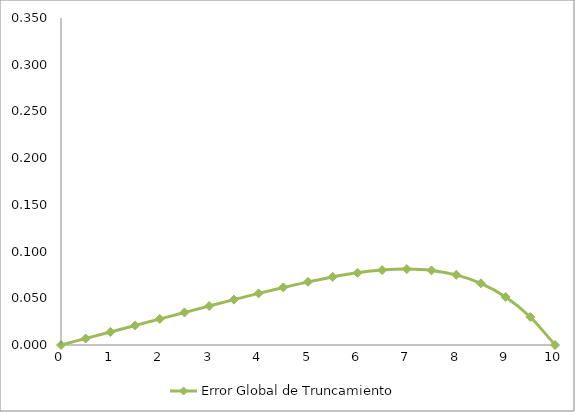
| Category | Error Global de Truncamiento |
|---|---|
| 0.0 | 0 |
| 0.5 | 0.007 |
| 1.0 | 0.014 |
| 1.5 | 0.021 |
| 2.0 | 0.028 |
| 2.5 | 0.035 |
| 3.0 | 0.042 |
| 3.5 | 0.049 |
| 4.0 | 0.055 |
| 4.5 | 0.062 |
| 5.0 | 0.068 |
| 5.5 | 0.073 |
| 6.0 | 0.077 |
| 6.5 | 0.08 |
| 7.0 | 0.081 |
| 7.5 | 0.08 |
| 8.0 | 0.075 |
| 8.5 | 0.066 |
| 9.0 | 0.051 |
| 9.5 | 0.03 |
| 10.0 | 0 |